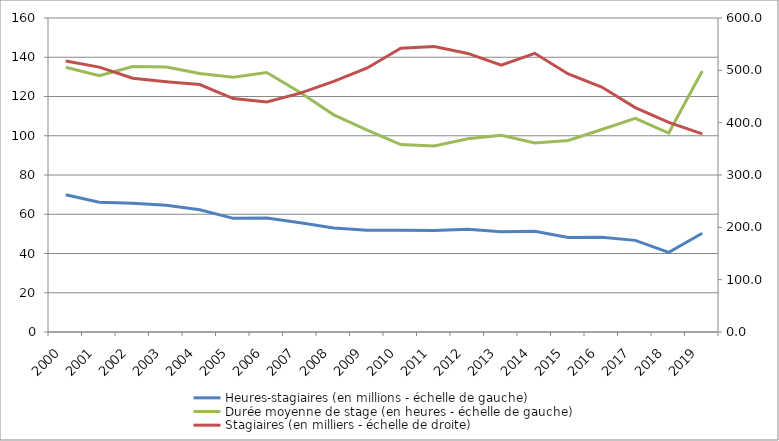
| Category | Heures-stagiaires (en millions - échelle de gauche) | Durée moyenne de stage (en heures - échelle de gauche) |
|---|---|---|
| 2000.0 | 69.9 | 134.942 |
| 2001.0 | 66.1 | 130.607 |
| 2002.0 | 65.6 | 135.286 |
| 2003.0 | 64.6 | 135.062 |
| 2004.0 | 62.3 | 131.74 |
| 2005.0 | 57.9 | 129.792 |
| 2006.0 | 58.1 | 132.226 |
| 2007.0 | 55.7 | 122.015 |
| 2008.0 | 53 | 110.647 |
| 2009.0 | 51.9 | 102.874 |
| 2010.0 | 51.8 | 95.537 |
| 2011.0 | 51.7 | 94.81 |
| 2012.0 | 52.4 | 98.441 |
| 2013.0 | 51.1 | 100.216 |
| 2014.0 | 51.3 | 96.338 |
| 2015.0 | 48.106 | 97.577 |
| 2016.0 | 48.3 | 103.205 |
| 2017.0 | 46.7 | 108.909 |
| 2018.0 | 40.6 | 101.373 |
| 2019.0 | 50.3 | 133 |